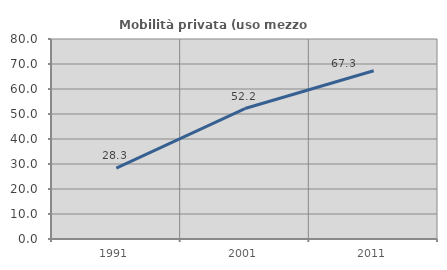
| Category | Mobilità privata (uso mezzo privato) |
|---|---|
| 1991.0 | 28.339 |
| 2001.0 | 52.18 |
| 2011.0 | 67.323 |